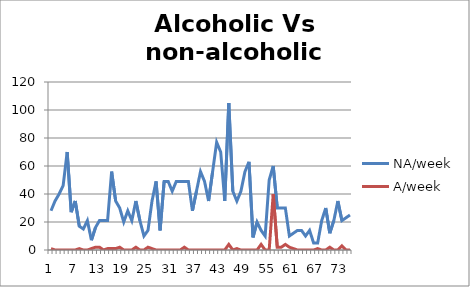
| Category | NA/week | A/week |
|---|---|---|
| 0 | 28 | 1 |
| 1 | 35 | 0 |
| 2 | 40 | 0 |
| 3 | 46 | 0 |
| 4 | 70 | 0 |
| 5 | 27 | 0 |
| 6 | 35 | 0 |
| 7 | 17 | 1 |
| 8 | 15 | 0 |
| 9 | 21 | 0 |
| 10 | 7 | 1 |
| 11 | 16 | 2 |
| 12 | 21 | 2 |
| 13 | 21 | 0 |
| 14 | 21 | 1 |
| 15 | 56 | 1 |
| 16 | 35 | 1 |
| 17 | 30 | 2 |
| 18 | 20 | 0 |
| 19 | 28 | 0 |
| 20 | 21 | 0 |
| 21 | 35 | 2 |
| 22 | 21 | 0 |
| 23 | 10 | 0 |
| 24 | 14 | 2 |
| 25 | 35 | 1 |
| 26 | 49 | 0 |
| 27 | 14 | 0 |
| 28 | 49 | 0 |
| 29 | 49 | 0 |
| 30 | 42 | 0 |
| 31 | 49 | 0 |
| 32 | 49 | 0 |
| 33 | 49 | 2 |
| 34 | 49 | 0 |
| 35 | 28 | 0 |
| 36 | 42 | 0 |
| 37 | 56 | 0 |
| 38 | 49 | 0 |
| 39 | 35 | 0 |
| 40 | 56 | 0 |
| 41 | 77 | 0 |
| 42 | 70 | 0 |
| 43 | 35 | 0 |
| 44 | 105 | 4 |
| 45 | 42 | 0.038 |
| 46 | 35 | 1 |
| 47 | 42 | 0 |
| 48 | 56 | 0 |
| 49 | 63 | 0 |
| 50 | 9 | 0 |
| 51 | 20 | 0 |
| 52 | 14 | 4 |
| 53 | 10 | 0 |
| 54 | 50 | 0 |
| 55 | 60 | 40 |
| 56 | 30 | 2 |
| 57 | 30 | 2 |
| 58 | 30 | 4 |
| 59 | 10 | 2 |
| 60 | 12 | 1 |
| 61 | 14 | 0 |
| 62 | 14 | 0 |
| 63 | 10 | 0 |
| 64 | 14 | 0 |
| 65 | 5 | 0 |
| 66 | 5 | 1 |
| 67 | 21 | 0 |
| 68 | 30 | 0 |
| 69 | 12 | 2 |
| 70 | 21 | 0 |
| 71 | 35 | 0 |
| 72 | 21 | 3 |
| 73 | 23 | 0 |
| 74 | 25 | 0 |